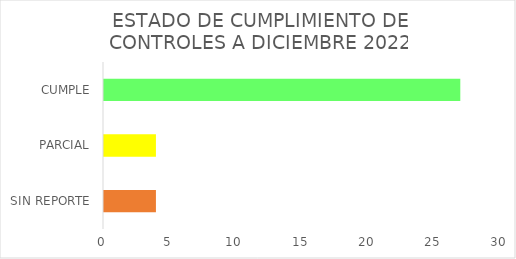
| Category | Series 0 |
|---|---|
| SIN REPORTE | 4 |
| PARCIAL | 4 |
| CUMPLE | 27 |